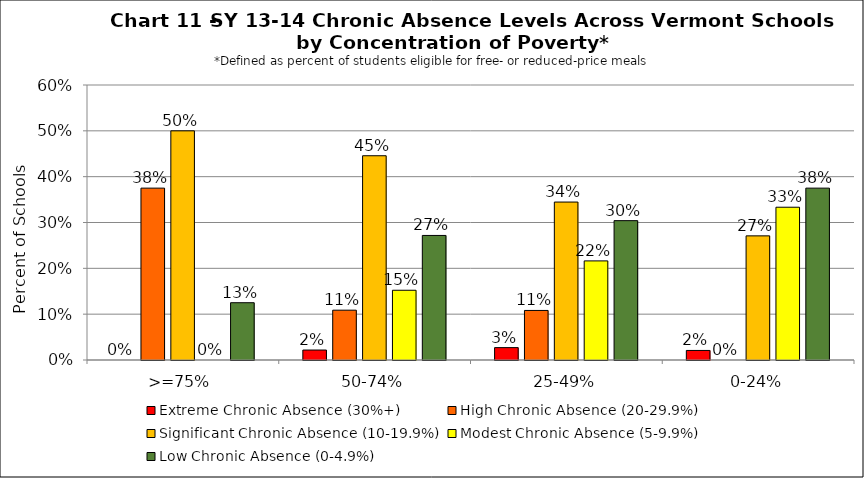
| Category | Extreme Chronic Absence (30%+) | High Chronic Absence (20-29.9%) | Significant Chronic Absence (10-19.9%) | Modest Chronic Absence (5-9.9%) | Low Chronic Absence (0-4.9%) |
|---|---|---|---|---|---|
| 0 | 0 | 0.375 | 0.5 | 0 | 0.125 |
| 1 | 0.022 | 0.109 | 0.446 | 0.152 | 0.272 |
| 2 | 0.027 | 0.108 | 0.345 | 0.216 | 0.304 |
| 3 | 0.021 | 0 | 0.271 | 0.333 | 0.375 |